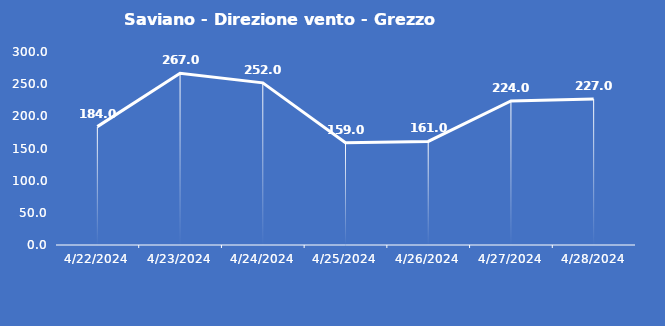
| Category | Saviano - Direzione vento - Grezzo (°N) |
|---|---|
| 4/22/24 | 184 |
| 4/23/24 | 267 |
| 4/24/24 | 252 |
| 4/25/24 | 159 |
| 4/26/24 | 161 |
| 4/27/24 | 224 |
| 4/28/24 | 227 |